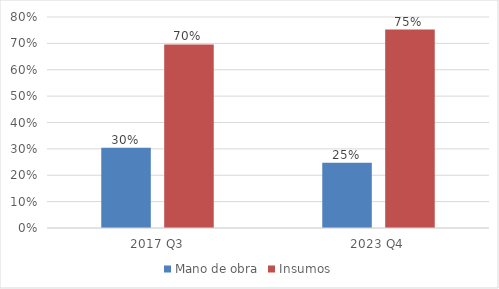
| Category | Mano de obra | Insumos |
|---|---|---|
| 2017 Q3 | 0.304 | 0.696 |
| 2023 Q4 | 0.248 | 0.752 |